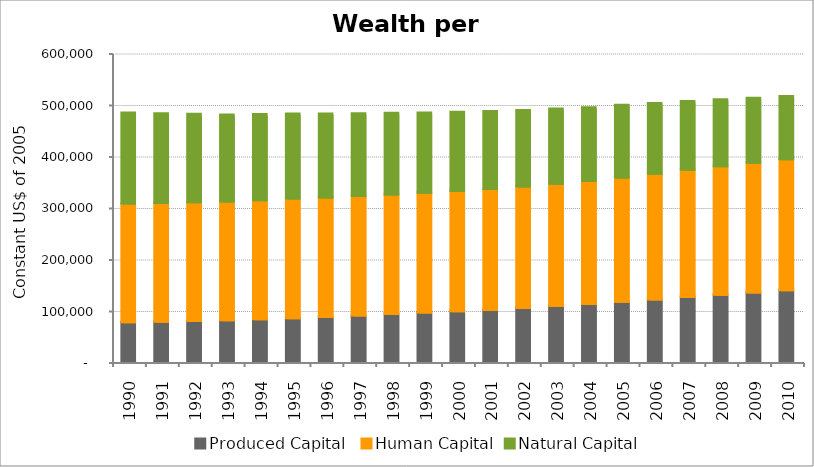
| Category | Produced Capital  | Human Capital | Natural Capital |
|---|---|---|---|
| 1990.0 | 77258.387 | 230355.734 | 175824.673 |
| 1991.0 | 78244.048 | 230718.746 | 173094.667 |
| 1992.0 | 79536.42 | 230542.959 | 170941.62 |
| 1993.0 | 81064.219 | 230452.519 | 168254.644 |
| 1994.0 | 83112.663 | 230928.68 | 166753.898 |
| 1995.0 | 85170.042 | 232079.367 | 164161.921 |
| 1996.0 | 87483.524 | 231984.835 | 162130.839 |
| 1997.0 | 90194.25 | 231967.877 | 159733.514 |
| 1998.0 | 92997.323 | 232403.074 | 157670.404 |
| 1999.0 | 96139.417 | 232369.576 | 154796.719 |
| 2000.0 | 98378.71 | 233654.789 | 152744.59 |
| 2001.0 | 101098.269 | 234605.41 | 150500.691 |
| 2002.0 | 104649.62 | 236246.562 | 147659.704 |
| 2003.0 | 108549.311 | 237746.953 | 144870.027 |
| 2004.0 | 112597.516 | 238722.637 | 142493.387 |
| 2005.0 | 116961.653 | 241502.64 | 140197.08 |
| 2006.0 | 121278.758 | 244405.063 | 136479.271 |
| 2007.0 | 126109.479 | 247211.941 | 132699.171 |
| 2008.0 | 130480.615 | 249544.055 | 129020.144 |
| 2009.0 | 134754.744 | 252048.938 | 125478.079 |
| 2010.0 | 139366.327 | 254340.066 | 122027.683 |